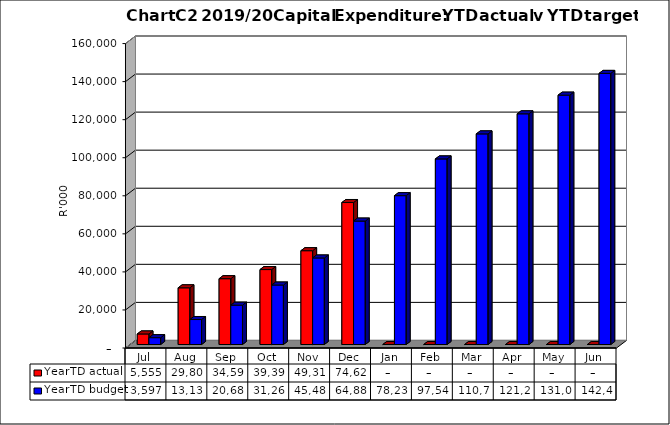
| Category | YearTD actual | YearTD budget |
|---|---|---|
| Jul | 5554740.23 | 3597000 |
| Aug | 29801091.39 | 13137000 |
| Sep | 34591330.1 | 20682000 |
| Oct | 39395801.57 | 31265000 |
| Nov | 49310833.03 | 45485000 |
| Dec | 74625500.45 | 64881000 |
| Jan | 0 | 78237000 |
| Feb | 0 | 97546000 |
| Mar | 0 | 110701000 |
| Apr | 0 | 121248000 |
| May | 0 | 131069000 |
| Jun | 0 | 142486000 |